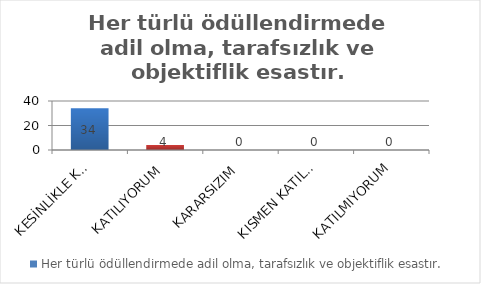
| Category | Her türlü ödüllendirmede adil olma, tarafsızlık ve objektiflik esastır. |
|---|---|
| KESİNLİKLE KATILIYORUM | 34 |
| KATILIYORUM | 4 |
| KARARSIZIM | 0 |
| KISMEN KATILIYORUM | 0 |
| KATILMIYORUM | 0 |